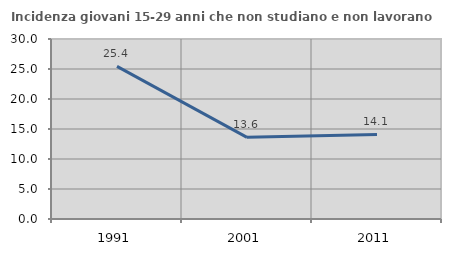
| Category | Incidenza giovani 15-29 anni che non studiano e non lavorano  |
|---|---|
| 1991.0 | 25.439 |
| 2001.0 | 13.61 |
| 2011.0 | 14.095 |